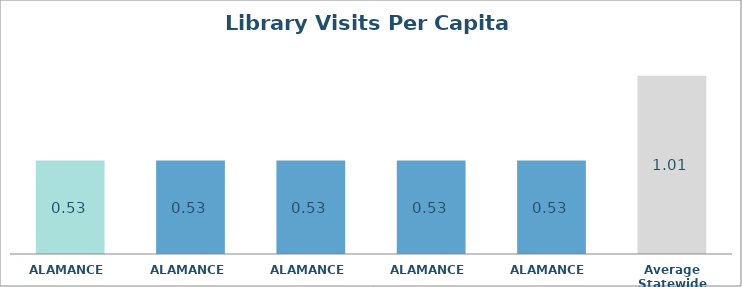
| Category | Series 0 |
|---|---|
| ALAMANCE  | 0.532 |
| ALAMANCE  | 0.532 |
| ALAMANCE  | 0.532 |
| ALAMANCE  | 0.532 |
| ALAMANCE  | 0.532 |
| Average Statewide | 1.014 |